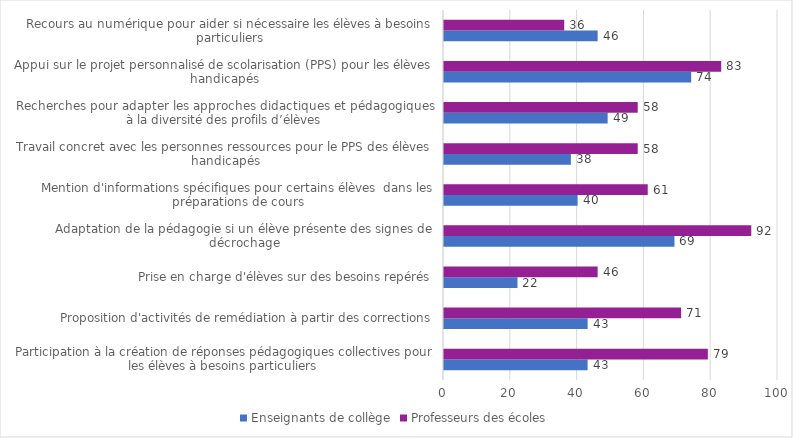
| Category | Enseignants de collège | Professeurs des écoles |
|---|---|---|
| Participation à la création de réponses pédagogiques collectives pour les élèves à besoins particuliers | 43 | 79 |
| Proposition d'activités de remédiation à partir des corrections | 43 | 71 |
| Prise en charge d'élèves sur des besoins repérés | 22 | 46 |
| Adaptation de la pédagogie si un élève présente des signes de décrochage | 69 | 92 |
| Mention d'informations spécifiques pour certains élèves  dans les préparations de cours | 40 | 61 |
| Travail concret avec les personnes ressources pour le PPS des élèves handicapés | 38 | 58 |
| Recherches pour adapter les approches didactiques et pédagogiques à la diversité des profils d’élèves | 49 | 58 |
| Appui sur le projet personnalisé de scolarisation (PPS) pour les élèves handicapés | 74 | 83 |
| Recours au numérique pour aider si nécessaire les élèves à besoins particuliers | 46 | 36 |